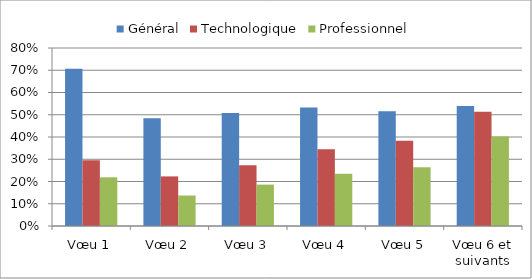
| Category | Général | Technologique | Professionnel |
|---|---|---|---|
| Vœu 1 | 0.706 | 0.295 | 0.219 |
| Vœu 2 | 0.485 | 0.223 | 0.137 |
| Vœu 3 | 0.508 | 0.273 | 0.186 |
| Vœu 4 | 0.532 | 0.345 | 0.234 |
| Vœu 5 | 0.516 | 0.384 | 0.264 |
| Vœu 6 et suivants | 0.539 | 0.513 | 0.402 |